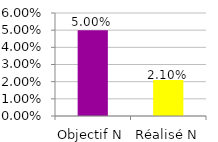
| Category | Series 0 |
|---|---|
| Objectif N | 0.05 |
| Réalisé N | 0.021 |